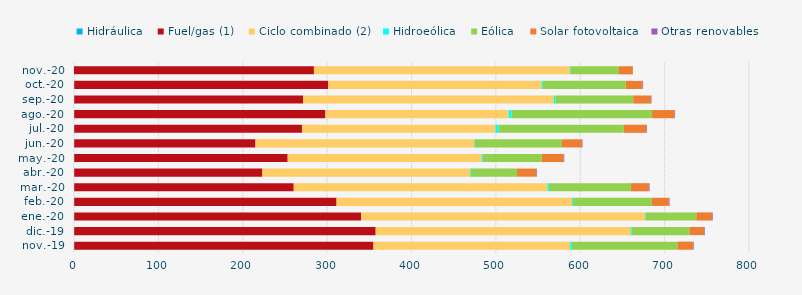
| Category | Hidráulica | Fuel/gas (1) | Ciclo combinado (2) | Hidroeólica | Eólica | Solar fotovoltaica | Otras renovables |
|---|---|---|---|---|---|---|---|
| nov.-19 | 0.297 | 354.637 | 233.081 | 2.097 | 125.116 | 18.324 | 0.873 |
| dic.-19 | 0.299 | 357.248 | 301.9 | 1.16 | 68.726 | 17.279 | 0.905 |
| ene.-20 | 0.304 | 339.847 | 336.412 | 0.825 | 60.204 | 18.499 | 0.876 |
| feb.-20 | 0.268 | 310.921 | 279.078 | 1.339 | 93.155 | 20.258 | 0.846 |
| mar.-20 | 0.299 | 260.141 | 300.755 | 1.824 | 97.166 | 21.187 | 0.822 |
| abr.-20 | 0.288 | 222.936 | 246.048 | 0.991 | 54.729 | 22.608 | 0.84 |
| may.-20 | 0.288 | 252.957 | 229.929 | 1.443 | 69.749 | 25.983 | 0.706 |
| jun.-20 | 0.272 | 214.832 | 258.953 | 0.743 | 103.362 | 23.718 | 0.785 |
| jul.-20 | 0.29 | 269.887 | 229.388 | 3.652 | 148.256 | 26.994 | 0.694 |
| ago.-20 | 0.294 | 297.661 | 217.205 | 3.576 | 166.405 | 26.574 | 0.691 |
| sep.-20 | 0.292 | 271.163 | 297.078 | 1.912 | 92.425 | 20.864 | 0.65 |
| oct.-20 | 0.299 | 301.034 | 252.831 | 1.457 | 98.27 | 19.858 | 0.783 |
| nov.-20 | 0 | 284.363 | 302.985 | 0.906 | 57.691 | 16.436 | 0 |